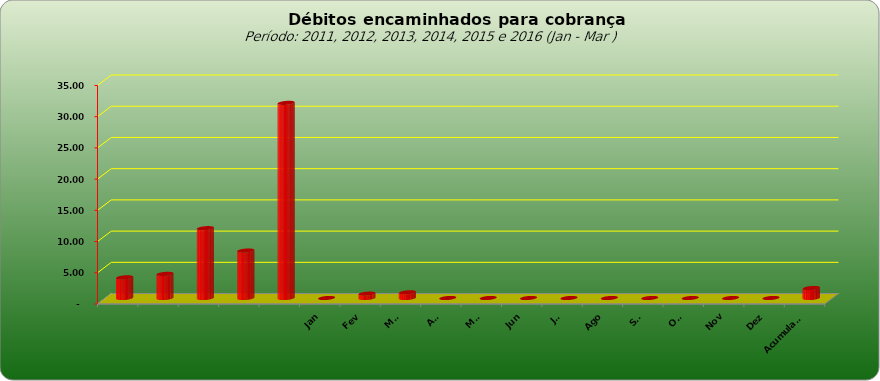
| Category |  3.309.443,02   3.859.728,44   11.181.928,25   7.600.526,01   31.248.623,50   -     695.716,82   906.394,22   -     -     -     -     -     -     -     -     -     1.602.111,04  |
|---|---|
|  | 3309443.02 |
|  | 3859728.44 |
|  | 11181928.25 |
|  | 7600526.01 |
|  | 31248623.5 |
| Jan | 0 |
| Fev | 695716.82 |
| Mar | 906394.22 |
| Abr | 0 |
| Mai | 0 |
| Jun | 0 |
| Jul | 0 |
| Ago | 0 |
| Set | 0 |
| Out | 0 |
| Nov | 0 |
| Dez | 0 |
| Acumulado | 1602111.04 |